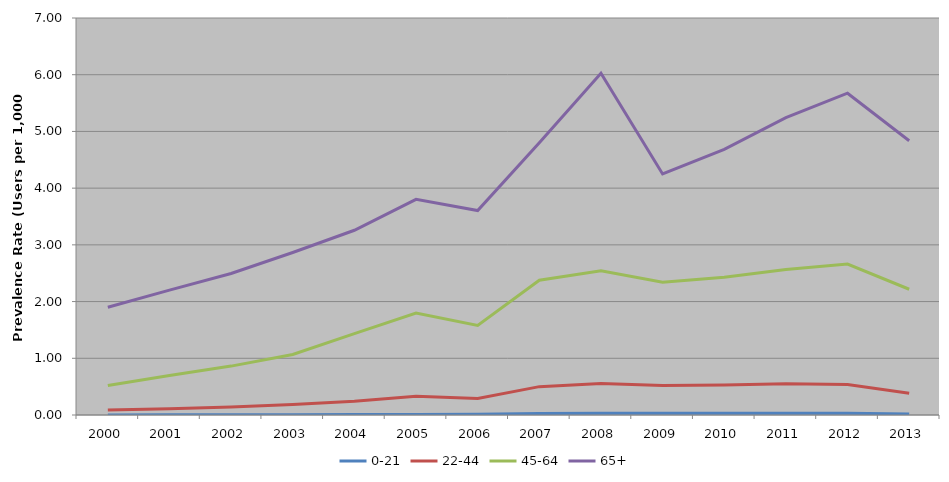
| Category | 0-21 | 22-44 | 45-64 | 65+ |
|---|---|---|---|---|
| 2000 | 0.002 | 0.088 | 0.519 | 1.899 |
| 2001 | 0.004 | 0.111 | 0.697 | 2.201 |
| 2002 | 0.005 | 0.14 | 0.862 | 2.496 |
| 2003 | 0.005 | 0.186 | 1.067 | 2.865 |
| 2004 | 0.01 | 0.244 | 1.434 | 3.257 |
| 2005 | 0.01 | 0.331 | 1.799 | 3.803 |
| 2006 | 0.014 | 0.292 | 1.579 | 3.605 |
| 2007 | 0.027 | 0.5 | 2.375 | 4.802 |
| 2008 | 0.03 | 0.555 | 2.544 | 6.025 |
| 2009 | 0.032 | 0.521 | 2.34 | 4.25 |
| 2010 | 0.031 | 0.527 | 2.43 | 4.682 |
| 2011 | 0.032 | 0.549 | 2.566 | 5.242 |
| 2012 | 0.032 | 0.538 | 2.66 | 5.674 |
| 2013 | 0.017 | 0.383 | 2.217 | 4.836 |